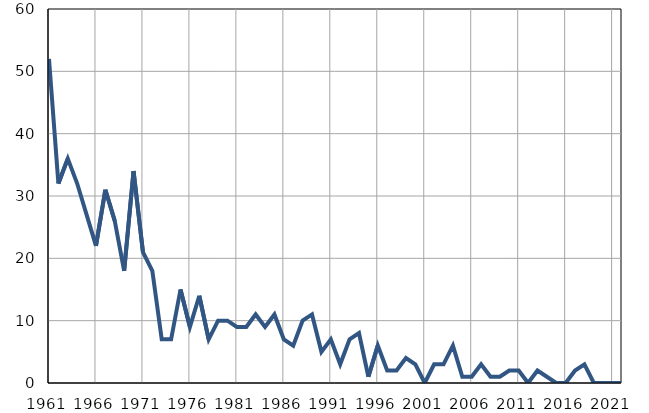
| Category | Умрла 
одојчад |
|---|---|
| 1961.0 | 52 |
| 1962.0 | 32 |
| 1963.0 | 36 |
| 1964.0 | 32 |
| 1965.0 | 27 |
| 1966.0 | 22 |
| 1967.0 | 31 |
| 1968.0 | 26 |
| 1969.0 | 18 |
| 1970.0 | 34 |
| 1971.0 | 21 |
| 1972.0 | 18 |
| 1973.0 | 7 |
| 1974.0 | 7 |
| 1975.0 | 15 |
| 1976.0 | 9 |
| 1977.0 | 14 |
| 1978.0 | 7 |
| 1979.0 | 10 |
| 1980.0 | 10 |
| 1981.0 | 9 |
| 1982.0 | 9 |
| 1983.0 | 11 |
| 1984.0 | 9 |
| 1985.0 | 11 |
| 1986.0 | 7 |
| 1987.0 | 6 |
| 1988.0 | 10 |
| 1989.0 | 11 |
| 1990.0 | 5 |
| 1991.0 | 7 |
| 1992.0 | 3 |
| 1993.0 | 7 |
| 1994.0 | 8 |
| 1995.0 | 1 |
| 1996.0 | 6 |
| 1997.0 | 2 |
| 1998.0 | 2 |
| 1999.0 | 4 |
| 2000.0 | 3 |
| 2001.0 | 0 |
| 2002.0 | 3 |
| 2003.0 | 3 |
| 2004.0 | 6 |
| 2005.0 | 1 |
| 2006.0 | 1 |
| 2007.0 | 3 |
| 2008.0 | 1 |
| 2009.0 | 1 |
| 2010.0 | 2 |
| 2011.0 | 2 |
| 2012.0 | 0 |
| 2013.0 | 2 |
| 2014.0 | 1 |
| 2015.0 | 0 |
| 2016.0 | 0 |
| 2017.0 | 2 |
| 2018.0 | 3 |
| 2019.0 | 0 |
| 2020.0 | 0 |
| 2021.0 | 0 |
| 2022.0 | 0 |